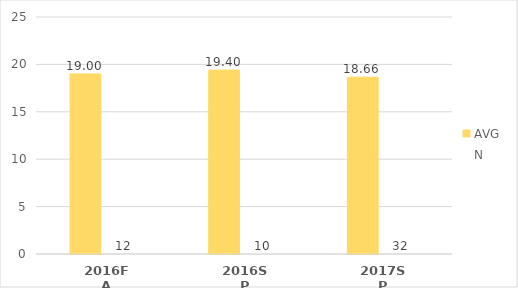
| Category | AVG | N |
|---|---|---|
| 2016FA | 19 | 12 |
| 2016SP | 19.4 | 10 |
| 2017SP | 18.656 | 32 |